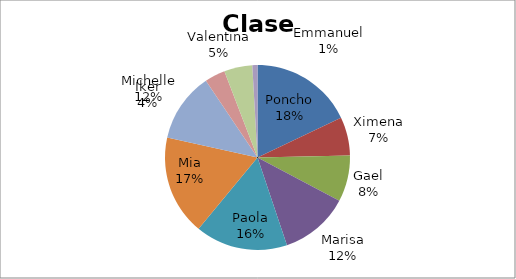
| Category | Clase | Casa | Participación | Exámen | Promedio | Promedio total |
|---|---|---|---|---|---|---|
| Poncho | 40 | 15 | 5 | 20 | 20 | 15.95 |
| Ximena | 15 | 18 | 8 | 18 | 14.75 | 14.75 |
| Gael | 18 | 6 | 9 | 15 | 12 | 12 |
| Marisa | 27 | 10 | 10 | 30 | 19.25 | 19.25 |
| Paola | 36 | 17 | 9 | 12 | 18.5 | 18.5 |
| Mia | 39 | 20 | 7 | 16 | 20.5 | 20.5 |
| Michelle | 27 | 6 | 8 | 29 | 17.5 | 17.5 |
| Iker | 8 | 4 | 9 | 27 | 12 | 12 |
| Valentina | 11 | 12 | 10 | 17 | 12.5 | 12.5 |
| Emmanuel | 2 | 10 | 10 | 28 | 12.5 | 12.5 |